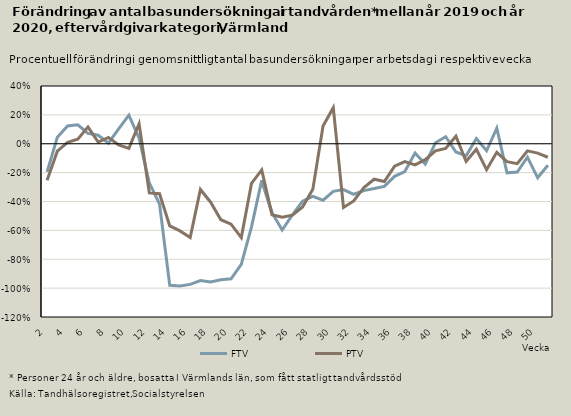
| Category | FTV | PTV |
|---|---|---|
| 2.0 | -0.195 | -0.254 |
| 3.0 | 0.045 | -0.052 |
| 4.0 | 0.123 | 0.01 |
| 5.0 | 0.132 | 0.031 |
| 6.0 | 0.072 | 0.117 |
| 7.0 | 0.059 | 0.012 |
| 8.0 | 0.004 | 0.044 |
| 9.0 | 0.103 | -0.008 |
| 10.0 | 0.199 | -0.032 |
| 11.0 | 0.038 | 0.139 |
| 12.0 | -0.272 | -0.341 |
| 13.0 | -0.417 | -0.346 |
| 14.0 | -0.981 | -0.569 |
| 15.0 | -0.985 | -0.604 |
| 16.0 | -0.974 | -0.649 |
| 17.0 | -0.947 | -0.317 |
| 18.0 | -0.958 | -0.405 |
| 19.0 | -0.942 | -0.526 |
| 20.0 | -0.935 | -0.557 |
| 21.0 | -0.835 | -0.65 |
| 22.0 | -0.575 | -0.275 |
| 23.0 | -0.254 | -0.181 |
| 24.0 | -0.478 | -0.491 |
| 25.0 | -0.597 | -0.508 |
| 26.0 | -0.493 | -0.495 |
| 27.0 | -0.398 | -0.438 |
| 28.0 | -0.365 | -0.315 |
| 29.0 | -0.391 | 0.123 |
| 30.0 | -0.329 | 0.25 |
| 31.0 | -0.318 | -0.442 |
| 32.0 | -0.35 | -0.396 |
| 33.0 | -0.325 | -0.303 |
| 34.0 | -0.309 | -0.246 |
| 35.0 | -0.295 | -0.262 |
| 36.0 | -0.226 | -0.156 |
| 37.0 | -0.192 | -0.123 |
| 38.0 | -0.064 | -0.146 |
| 39.0 | -0.141 | -0.11 |
| 40.0 | 0.006 | -0.049 |
| 41.0 | 0.049 | -0.033 |
| 42.0 | -0.057 | 0.052 |
| 43.0 | -0.084 | -0.123 |
| 44.0 | 0.036 | -0.038 |
| 45.0 | -0.049 | -0.18 |
| 46.0 | 0.108 | -0.059 |
| 47.0 | -0.201 | -0.124 |
| 48.0 | -0.196 | -0.138 |
| 49.0 | -0.093 | -0.049 |
| 50.0 | -0.236 | -0.065 |
| 51.0 | -0.149 | -0.093 |